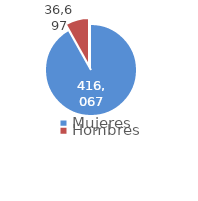
| Category | Series 0 |
|---|---|
| Mujeres | 416067 |
| Hombres | 36697 |